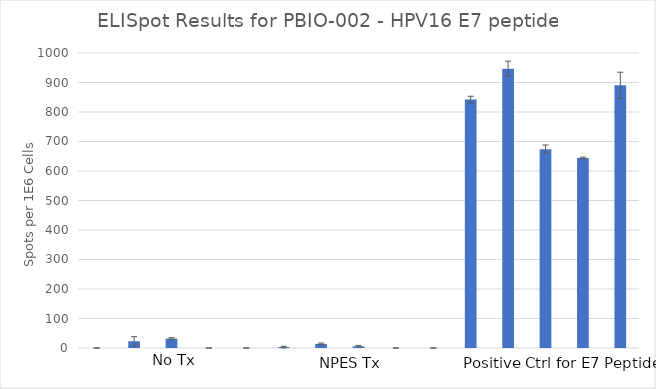
| Category | Series 0 |
|---|---|
| No Tx | 0 |
|  | 23 |
|  | 32 |
|  | 0 |
|  | 0 |
| NPES Tx | 3 |
|  | 14 |
|  | 6 |
|  | 0 |
|  | 0 |
| Positive Control | 842 |